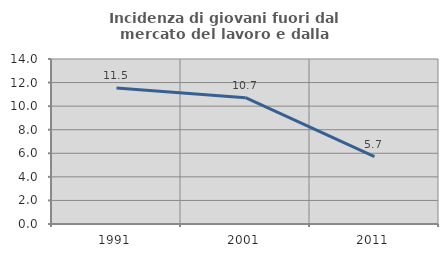
| Category | Incidenza di giovani fuori dal mercato del lavoro e dalla formazione  |
|---|---|
| 1991.0 | 11.538 |
| 2001.0 | 10.714 |
| 2011.0 | 5.714 |